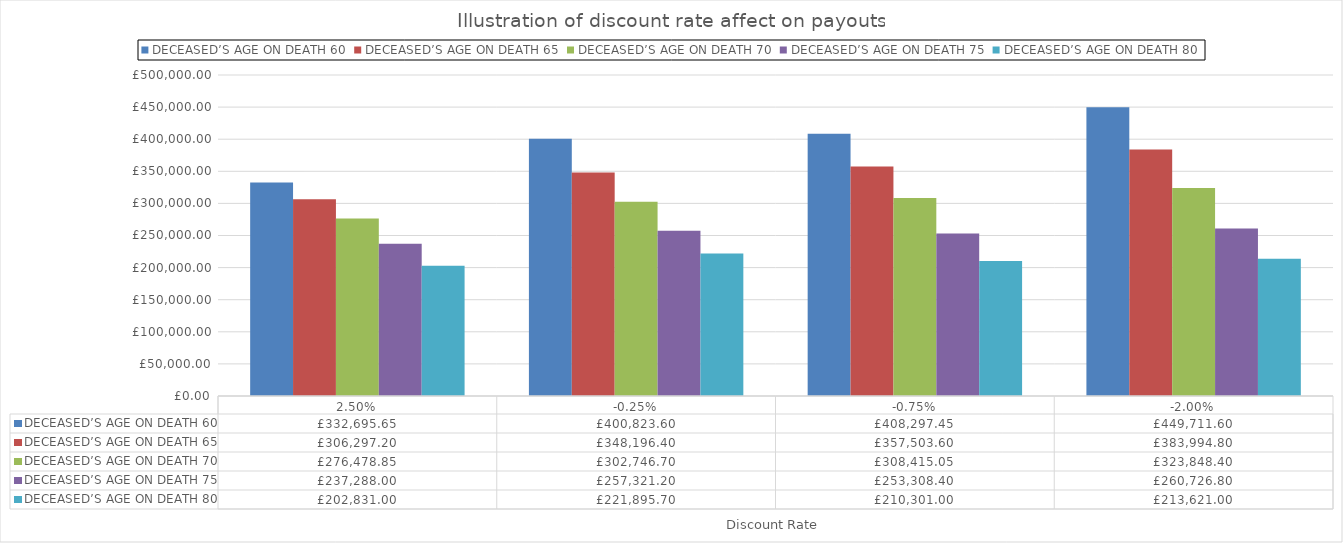
| Category | DECEASED’S AGE ON DEATH |
|---|---|
| 0.025 | 202831 |
| -0.0025 | 221895.7 |
| -0.0075 | 210301 |
| -0.02 | 213621 |